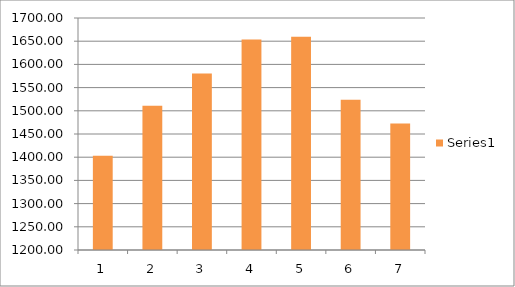
| Category | Series 0 |
|---|---|
| 0 | 1402.9 |
| 1 | 1510.9 |
| 2 | 1580.4 |
| 3 | 1653.9 |
| 4 | 1659.8 |
| 5 | 1524 |
| 6 | 1472.6 |